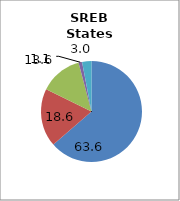
| Category | SREB states2 |
|---|---|
| White | 63.639 |
| Black | 18.614 |
| Hispanic | 13.618 |
| Two or More Races | 1.139 |
| All Other1 | 2.99 |